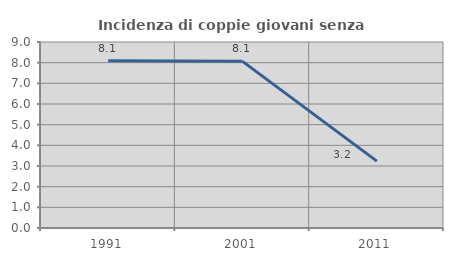
| Category | Incidenza di coppie giovani senza figli |
|---|---|
| 1991.0 | 8.088 |
| 2001.0 | 8.065 |
| 2011.0 | 3.235 |